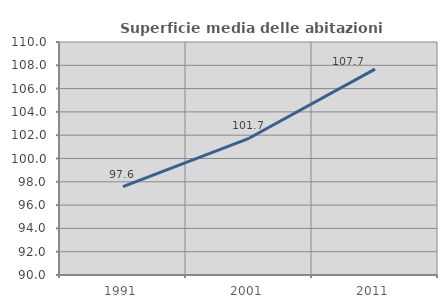
| Category | Superficie media delle abitazioni occupate |
|---|---|
| 1991.0 | 97.581 |
| 2001.0 | 101.735 |
| 2011.0 | 107.676 |